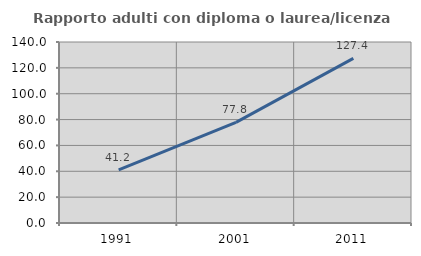
| Category | Rapporto adulti con diploma o laurea/licenza media  |
|---|---|
| 1991.0 | 41.171 |
| 2001.0 | 77.793 |
| 2011.0 | 127.364 |